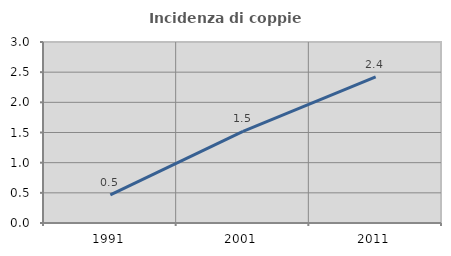
| Category | Incidenza di coppie miste |
|---|---|
| 1991.0 | 0.465 |
| 2001.0 | 1.517 |
| 2011.0 | 2.421 |